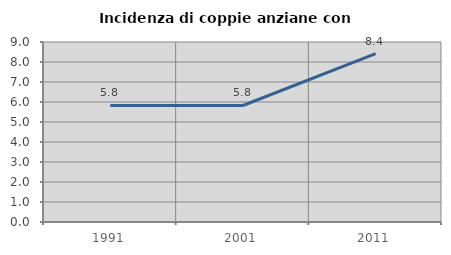
| Category | Incidenza di coppie anziane con figli |
|---|---|
| 1991.0 | 5.825 |
| 2001.0 | 5.825 |
| 2011.0 | 8.421 |